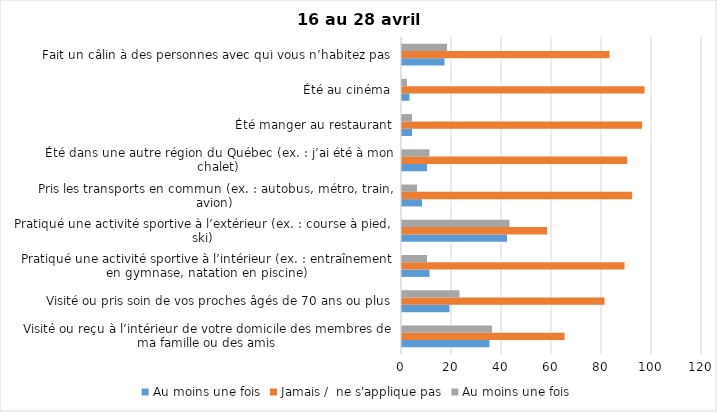
| Category | Au moins une fois | Jamais /  ne s'applique pas |
|---|---|---|
| Visité ou reçu à l’intérieur de votre domicile des membres de ma famille ou des amis | 36 | 65 |
| Visité ou pris soin de vos proches âgés de 70 ans ou plus | 23 | 81 |
| Pratiqué une activité sportive à l’intérieur (ex. : entraînement en gymnase, natation en piscine) | 10 | 89 |
| Pratiqué une activité sportive à l’extérieur (ex. : course à pied, ski) | 43 | 58 |
| Pris les transports en commun (ex. : autobus, métro, train, avion) | 6 | 92 |
| Été dans une autre région du Québec (ex. : j’ai été à mon chalet) | 11 | 90 |
| Été manger au restaurant | 4 | 96 |
| Été au cinéma | 2 | 97 |
| Fait un câlin à des personnes avec qui vous n’habitez pas | 18 | 83 |